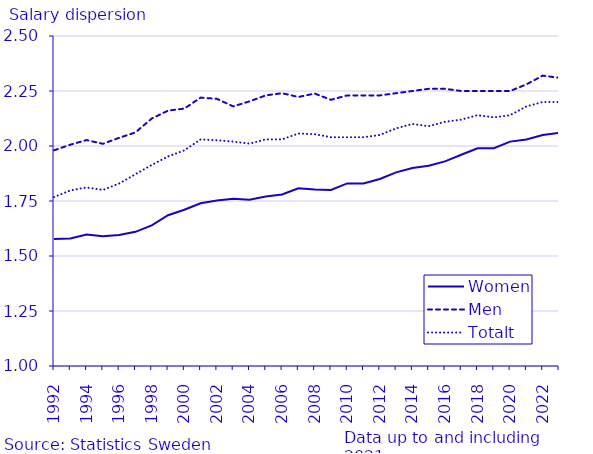
| Category | Women | Men | Totalt |
|---|---|---|---|
| 1992.0 | 1.578 | 1.98 | 1.768 |
| 1993.0 | 1.58 | 2.006 | 1.798 |
| 1994.0 | 1.598 | 2.027 | 1.812 |
| 1995.0 | 1.59 | 2.01 | 1.8 |
| 1996.0 | 1.596 | 2.037 | 1.83 |
| 1997.0 | 1.61 | 2.062 | 1.871 |
| 1998.0 | 1.639 | 2.125 | 1.914 |
| 1999.0 | 1.685 | 2.161 | 1.953 |
| 2000.0 | 1.71 | 2.17 | 1.98 |
| 2001.0 | 1.74 | 2.22 | 2.03 |
| 2002.0 | 1.752 | 2.214 | 2.026 |
| 2003.0 | 1.76 | 2.18 | 2.02 |
| 2004.0 | 1.756 | 2.203 | 2.011 |
| 2005.0 | 1.77 | 2.23 | 2.03 |
| 2006.0 | 1.78 | 2.24 | 2.03 |
| 2007.0 | 1.808 | 2.223 | 2.057 |
| 2008.0 | 1.802 | 2.238 | 2.054 |
| 2009.0 | 1.8 | 2.21 | 2.04 |
| 2010.0 | 1.83 | 2.23 | 2.04 |
| 2011.0 | 1.83 | 2.23 | 2.04 |
| 2012.0 | 1.85 | 2.23 | 2.05 |
| 2013.0 | 1.88 | 2.24 | 2.08 |
| 2014.0 | 1.9 | 2.25 | 2.1 |
| 2015.0 | 1.91 | 2.26 | 2.09 |
| 2016.0 | 1.93 | 2.26 | 2.11 |
| 2017.0 | 1.96 | 2.25 | 2.12 |
| 2018.0 | 1.99 | 2.25 | 2.14 |
| 2019.0 | 1.99 | 2.25 | 2.13 |
| 2020.0 | 2.02 | 2.25 | 2.14 |
| 2021.0 | 2.03 | 2.28 | 2.18 |
| 2022.0 | 2.05 | 2.32 | 2.2 |
| 2023.0 | 2.06 | 2.31 | 2.2 |